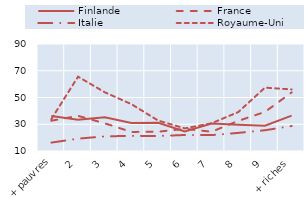
| Category | Finlande | France | Italie | Royaume-Uni |
|---|---|---|---|---|
|  + pauvres | 36.12 | 32.64 | 16.28 | 33.84 |
| 2 | 33.45 | 36.28 | 19.23 | 65.59 |
| 3 | 35.16 | 30.69 | 20.93 | 53.92 |
| 4 | 30.97 | 24.26 | 21.34 | 44.99 |
| 5 | 31.15 | 24.43 | 21.2 | 32.76 |
| 6 | 24.69 | 26.53 | 21.97 | 26.91 |
| 7 | 30.62 | 24.41 | 21.89 | 30.72 |
| 8 | 29.66 | 32.51 | 23.54 | 39.09 |
| 9 | 28.84 | 39.21 | 25.52 | 57.38 |
|  + riches | 36.47 | 53.8 | 28.69 | 56.02 |